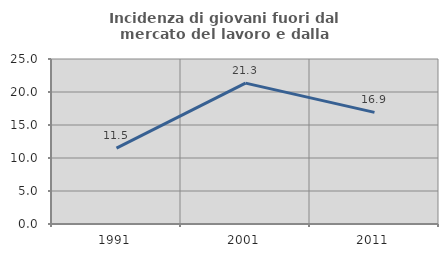
| Category | Incidenza di giovani fuori dal mercato del lavoro e dalla formazione  |
|---|---|
| 1991.0 | 11.493 |
| 2001.0 | 21.347 |
| 2011.0 | 16.914 |